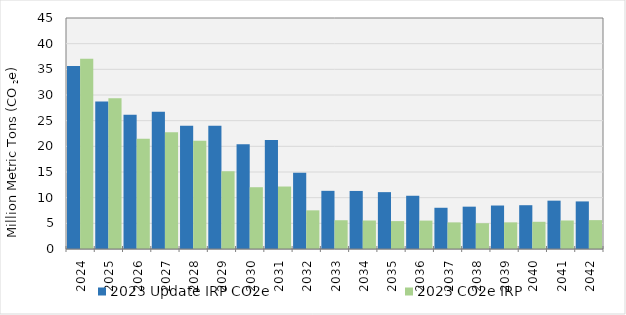
| Category | 2023 Update IRP CO2e | 2023 CO2e IRP |
|---|---|---|
| 2024.0 | 35.666 | 37.056 |
| 2025.0 | 28.732 | 29.36 |
| 2026.0 | 26.16 | 21.472 |
| 2027.0 | 26.721 | 22.724 |
| 2028.0 | 24.014 | 21.108 |
| 2029.0 | 24.025 | 15.153 |
| 2030.0 | 20.393 | 12.034 |
| 2031.0 | 21.213 | 12.172 |
| 2032.0 | 14.871 | 7.532 |
| 2033.0 | 11.332 | 5.603 |
| 2034.0 | 11.308 | 5.551 |
| 2035.0 | 11.077 | 5.434 |
| 2036.0 | 10.372 | 5.534 |
| 2037.0 | 8.033 | 5.181 |
| 2038.0 | 8.247 | 5.024 |
| 2039.0 | 8.469 | 5.188 |
| 2040.0 | 8.53 | 5.3 |
| 2041.0 | 9.416 | 5.556 |
| 2042.0 | 9.269 | 5.624 |